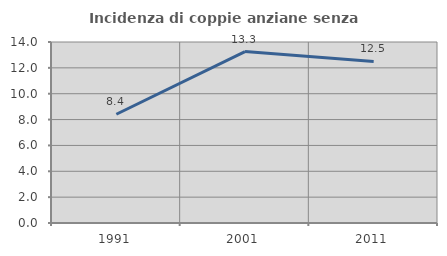
| Category | Incidenza di coppie anziane senza figli  |
|---|---|
| 1991.0 | 8.413 |
| 2001.0 | 13.258 |
| 2011.0 | 12.5 |